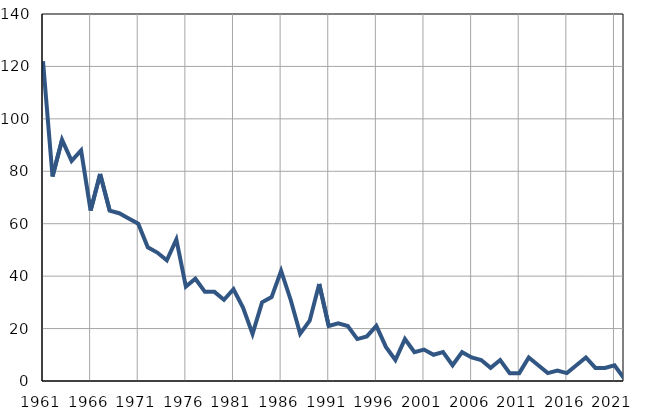
| Category | Infants
deaths |
|---|---|
| 1961.0 | 122 |
| 1962.0 | 78 |
| 1963.0 | 92 |
| 1964.0 | 84 |
| 1965.0 | 88 |
| 1966.0 | 65 |
| 1967.0 | 79 |
| 1968.0 | 65 |
| 1969.0 | 64 |
| 1970.0 | 62 |
| 1971.0 | 60 |
| 1972.0 | 51 |
| 1973.0 | 49 |
| 1974.0 | 46 |
| 1975.0 | 54 |
| 1976.0 | 36 |
| 1977.0 | 39 |
| 1978.0 | 34 |
| 1979.0 | 34 |
| 1980.0 | 31 |
| 1981.0 | 35 |
| 1982.0 | 28 |
| 1983.0 | 18 |
| 1984.0 | 30 |
| 1985.0 | 32 |
| 1986.0 | 42 |
| 1987.0 | 31 |
| 1988.0 | 18 |
| 1989.0 | 23 |
| 1990.0 | 37 |
| 1991.0 | 21 |
| 1992.0 | 22 |
| 1993.0 | 21 |
| 1994.0 | 16 |
| 1995.0 | 17 |
| 1996.0 | 21 |
| 1997.0 | 13 |
| 1998.0 | 8 |
| 1999.0 | 16 |
| 2000.0 | 11 |
| 2001.0 | 12 |
| 2002.0 | 10 |
| 2003.0 | 11 |
| 2004.0 | 6 |
| 2005.0 | 11 |
| 2006.0 | 9 |
| 2007.0 | 8 |
| 2008.0 | 5 |
| 2009.0 | 8 |
| 2010.0 | 3 |
| 2011.0 | 3 |
| 2012.0 | 9 |
| 2013.0 | 6 |
| 2014.0 | 3 |
| 2015.0 | 4 |
| 2016.0 | 3 |
| 2017.0 | 6 |
| 2018.0 | 9 |
| 2019.0 | 5 |
| 2020.0 | 5 |
| 2021.0 | 6 |
| 2022.0 | 1 |